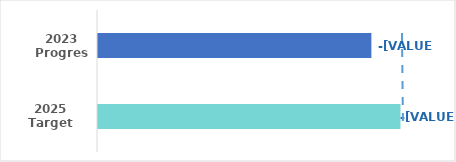
| Category | Series 0 |
|---|---|
| 2023 Progress | 0.57 |
| 2025 Target | 0.62 |